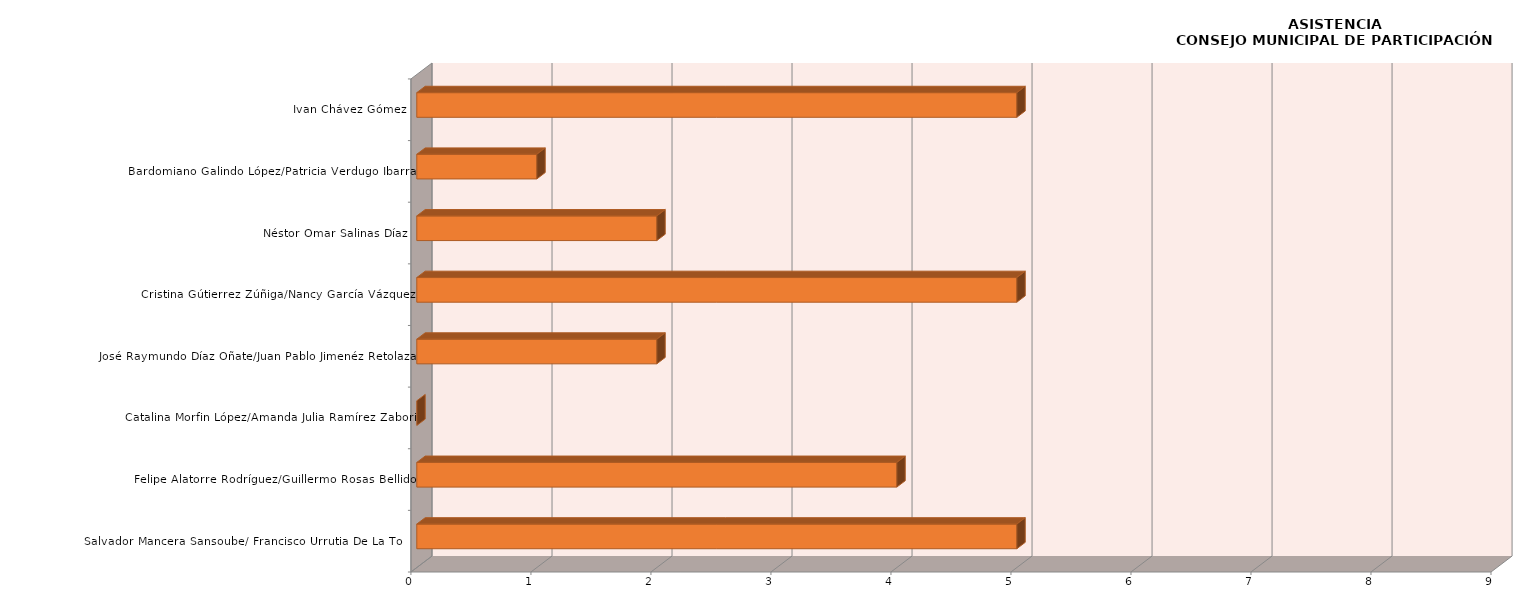
| Category | Series 0 |
|---|---|
| Salvador Mancera Sansoube/ Francisco Urrutia De La Torre | 5 |
| Felipe Alatorre Rodríguez/Guillermo Rosas Bellido | 4 |
| Catalina Morfin López/Amanda Julia Ramírez Zabori | 0 |
| José Raymundo Díaz Oñate/Juan Pablo Jimenéz Retolaza | 2 |
| Cristina Gútierrez Zúñiga/Nancy García Vázquez | 5 |
| Néstor Omar Salinas Díaz | 2 |
| Bardomiano Galindo López/Patricia Verdugo Ibarra | 1 |
| Ivan Chávez Gómez | 5 |